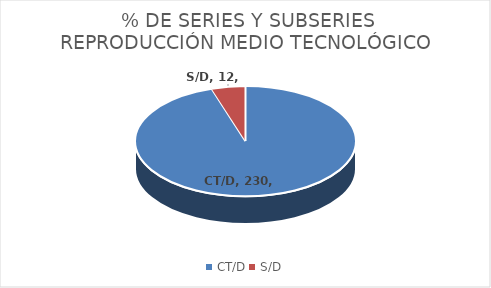
| Category | Series 0 |
|---|---|
| CT/D | 230 |
| S/D | 12 |